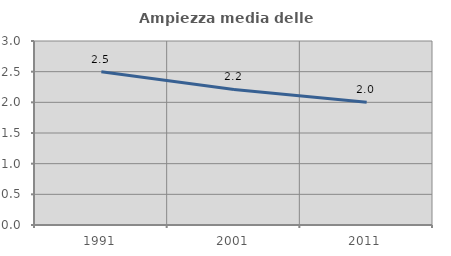
| Category | Ampiezza media delle famiglie |
|---|---|
| 1991.0 | 2.5 |
| 2001.0 | 2.21 |
| 2011.0 | 2 |